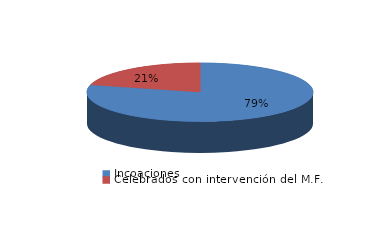
| Category | Series 0 |
|---|---|
| Incoaciones | 462 |
| Celebrados con intervención del M.F. | 123 |